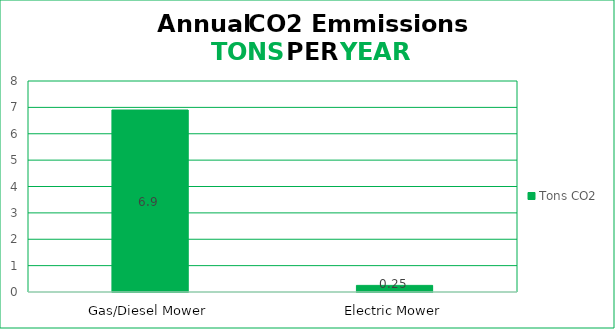
| Category | Tons CO2 |
|---|---|
| Gas/Diesel Mower | 6.9 |
| Electric Mower | 0.251 |